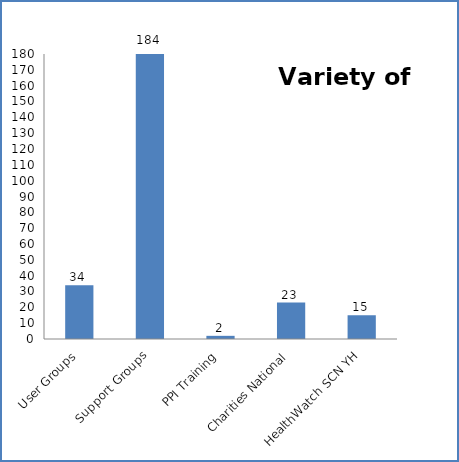
| Category | Series 0 |
|---|---|
| User Groups | 34 |
| Support Groups | 184 |
| PPI Training | 2 |
| Charities National | 23 |
| HealthWatch SCN YH | 15 |